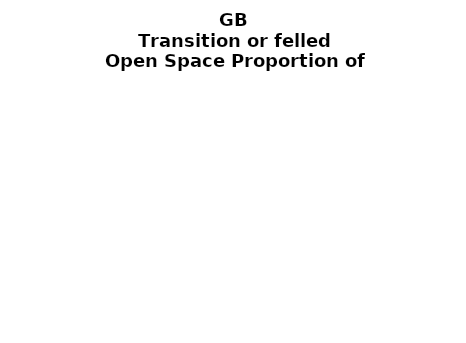
| Category | Transition or felled |
|---|---|
|  ≥ 10ha, < 10%  | 0.099 |
|   ≥ 10ha, 10-25% | 0.045 |
|   ≥ 10ha, > 25 and <50%  | 0.103 |
|   ≥ 10ha, ≥ 50%  | 0.519 |
|  < 10ha, < 10% | 0.007 |
|  < 10ha, 10-25% | 0.022 |
|  < 10ha, > 25 and < 50% | 0.029 |
|  < 10ha, ≥ 50% | 0.176 |